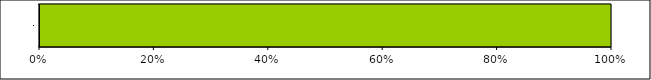
| Category | Series 0 | Series 1 | Series 2 | Series 3 |
|---|---|---|---|---|
| 0 | 0 | 0 | 3 | 0 |